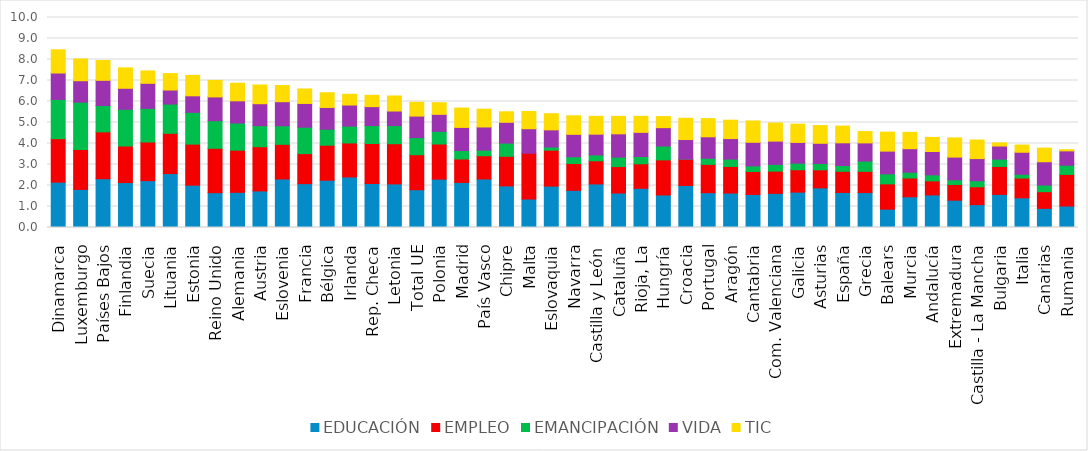
| Category | EDUCACIÓN | EMPLEO | EMANCIPACIÓN | VIDA | TIC |
|---|---|---|---|---|---|
| Dinamarca | 2.159 | 2.071 | 1.868 | 1.258 | 1.107 |
| Luxemburgo | 1.814 | 1.899 | 2.257 | 1.019 | 1.04 |
| Países Bajos | 2.324 | 2.231 | 1.255 | 1.199 | 0.942 |
| Finlandia | 2.14 | 1.74 | 1.749 | 1 | 0.973 |
| Suecia | 2.231 | 1.839 | 1.602 | 1.193 | 0.589 |
| Lituania | 2.569 | 1.915 | 1.394 | 0.669 | 0.783 |
| Estonia | 2.016 | 1.955 | 1.513 | 0.787 | 0.973 |
| Reino Unido | 1.659 | 2.111 | 1.316 | 1.131 | 0.786 |
| Alemania | 1.675 | 2.006 | 1.293 | 1.057 | 0.838 |
| Austria | 1.741 | 2.106 | 1.002 | 1.046 | 0.892 |
| Eslovenia | 2.311 | 1.649 | 0.886 | 1.146 | 0.77 |
| Francia | 2.087 | 1.431 | 1.258 | 1.131 | 0.688 |
| Bélgica | 2.251 | 1.667 | 0.764 | 1.035 | 0.701 |
| Irlanda | 2.407 | 1.619 | 0.801 | 1.004 | 0.513 |
| Rep. Checa | 2.094 | 1.905 | 0.856 | 0.9 | 0.538 |
| Letonia | 2.077 | 1.912 | 0.864 | 0.693 | 0.716 |
| Total UE | 1.799 | 1.668 | 0.813 | 1.025 | 0.66 |
| Polonia | 2.302 | 1.673 | 0.602 | 0.81 | 0.554 |
| Madrid | 2.146 | 1.117 | 0.402 | 1.101 | 0.922 |
| País Vasco | 2.31 | 1.107 | 0.27 | 1.099 | 0.849 |
| Chipre | 1.982 | 1.409 | 0.628 | 0.99 | 0.502 |
| Malta | 1.356 | 2.178 | -0.044 | 1.168 | 0.822 |
| Eslovaquia | 1.971 | 1.711 | 0.151 | 0.817 | 0.768 |
| Navarra | 1.769 | 1.279 | 0.32 | 1.067 | 0.882 |
| Castilla y León | 2.075 | 1.1 | 0.281 | 0.987 | 0.851 |
| Cataluña | 1.642 | 1.26 | 0.449 | 1.11 | 0.831 |
| Rioja, La | 1.866 | 1.167 | 0.346 | 1.15 | 0.762 |
| Hungría | 1.55 | 1.67 | 0.659 | 0.876 | 0.527 |
| Croacia | 2.003 | 1.251 | 0.006 | 0.929 | 1.012 |
| Portugal | 1.657 | 1.347 | 0.293 | 1.022 | 0.865 |
| Aragón | 1.641 | 1.263 | 0.357 | 0.975 | 0.875 |
| Cantabria | 1.573 | 1.095 | 0.266 | 1.123 | 1.015 |
| Com. Valenciana | 1.624 | 1.06 | 0.322 | 1.107 | 0.862 |
| Galicia | 1.684 | 1.068 | 0.311 | 0.988 | 0.872 |
| Asturias | 1.887 | 0.859 | 0.302 | 0.961 | 0.845 |
| España | 1.669 | 1.008 | 0.277 | 1.08 | 0.796 |
| Grecia | 1.663 | 1.011 | 0.489 | 0.865 | 0.539 |
| Balears | 0.872 | 1.205 | 0.479 | 1.082 | 0.904 |
| Murcia | 1.462 | 0.893 | 0.278 | 1.118 | 0.779 |
| Andalucía | 1.552 | 0.669 | 0.287 | 1.11 | 0.672 |
| Extremadura | 1.301 | 0.745 | 0.224 | 1.083 | 0.913 |
| Castilla - La Mancha | 1.089 | 0.85 | 0.29 | 1.053 | 0.884 |
| Bulgaria | 1.576 | 1.327 | 0.354 | 0.621 | 0.15 |
| Italia | 1.412 | 0.942 | 0.181 | 1.049 | 0.343 |
| Canarias | 0.913 | 0.793 | 0.316 | 1.109 | 0.651 |
| Rumania | 1.023 | 1.504 | 0.439 | 0.683 | 0.056 |